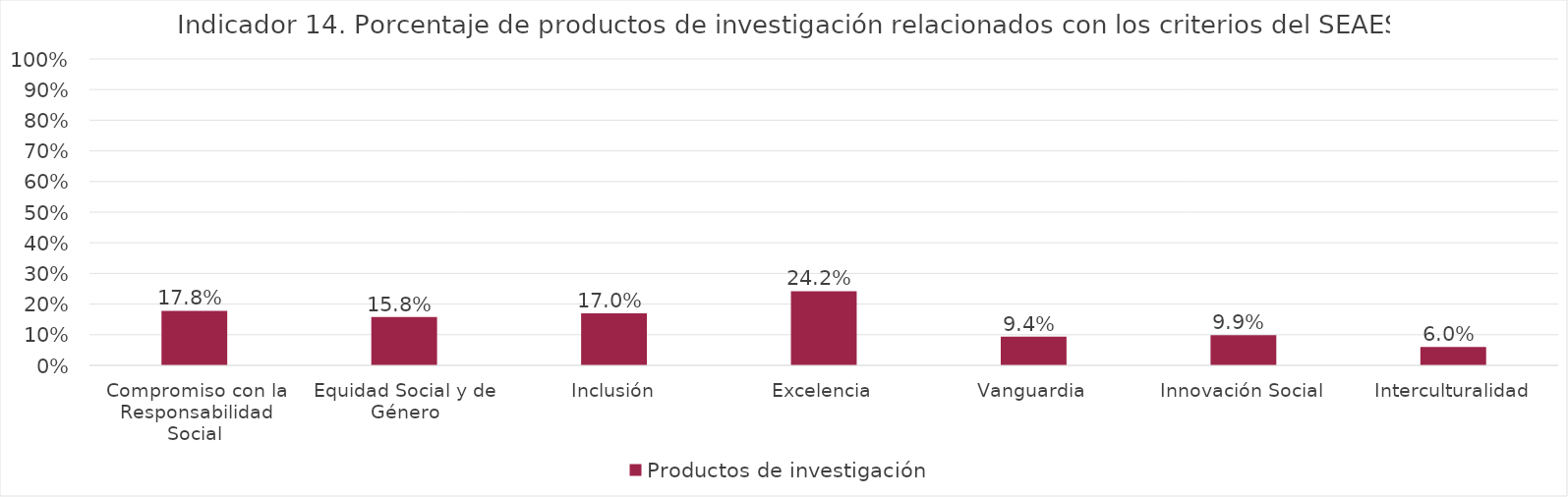
| Category | Productos de investigación |
|---|---|
| Compromiso con la Responsabilidad Social | 0.178 |
| Equidad Social y de Género | 0.158 |
| Inclusión | 0.17 |
| Excelencia | 0.242 |
| Vanguardia | 0.094 |
| Innovación Social | 0.099 |
| Interculturalidad | 0.06 |